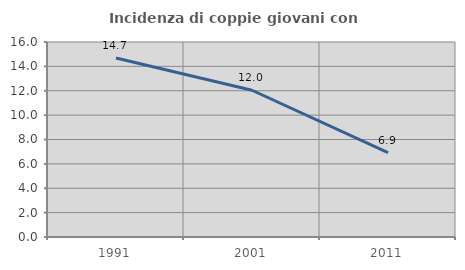
| Category | Incidenza di coppie giovani con figli |
|---|---|
| 1991.0 | 14.694 |
| 2001.0 | 12.041 |
| 2011.0 | 6.92 |